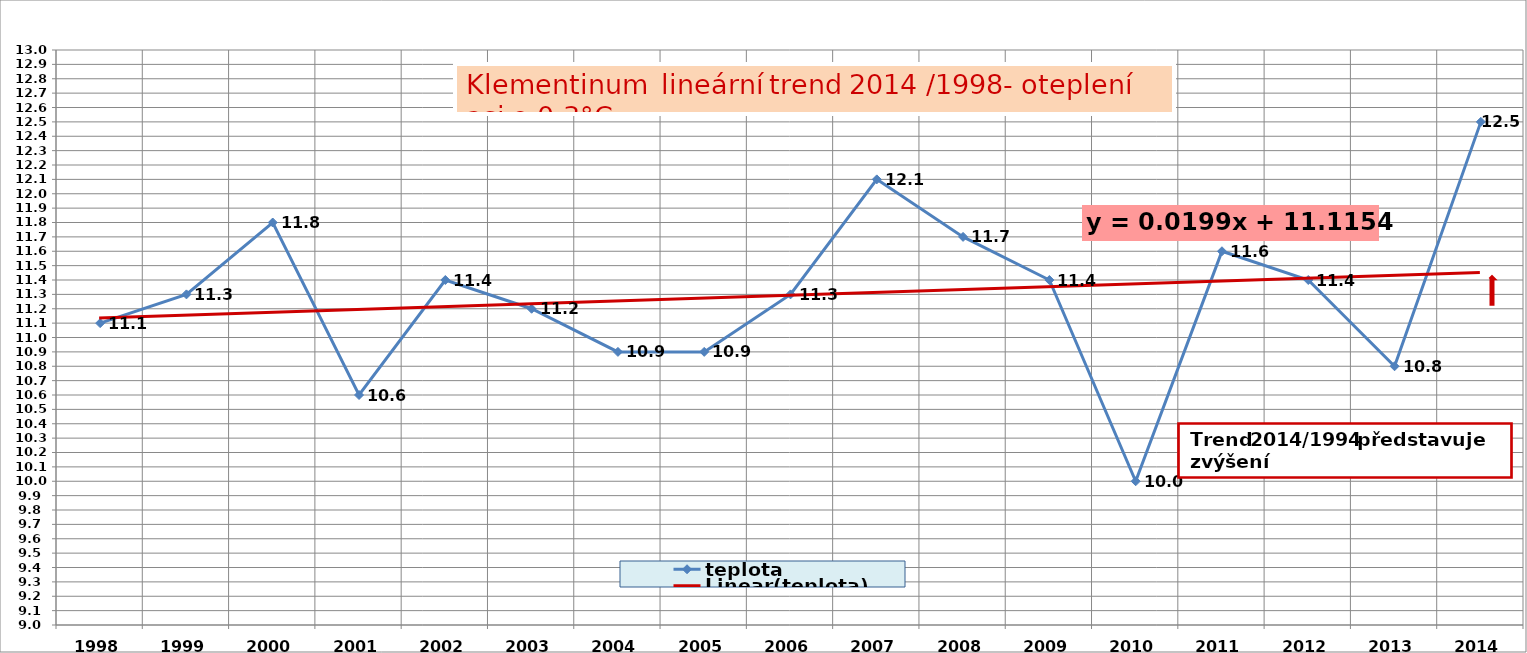
| Category | teplota |
|---|---|
| 1998.0 | 11.1 |
| 1999.0 | 11.3 |
| 2000.0 | 11.8 |
| 2001.0 | 10.6 |
| 2002.0 | 11.4 |
| 2003.0 | 11.2 |
| 2004.0 | 10.9 |
| 2005.0 | 10.9 |
| 2006.0 | 11.3 |
| 2007.0 | 12.1 |
| 2008.0 | 11.7 |
| 2009.0 | 11.4 |
| 2010.0 | 10 |
| 2011.0 | 11.6 |
| 2012.0 | 11.4 |
| 2013.0 | 10.8 |
| 2014.0 | 12.5 |